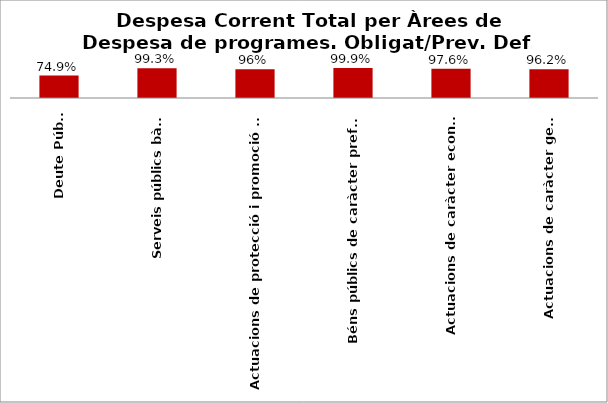
| Category | Series 0 |
|---|---|
| Deute Públic | 0.749 |
| Serveis públics bàsics | 0.993 |
| Actuacions de protecció i promoció social | 0.962 |
| Béns públics de caràcter preferent | 0.999 |
| Actuacions de caràcter econòmic | 0.976 |
| Actuacions de caràcter general | 0.962 |